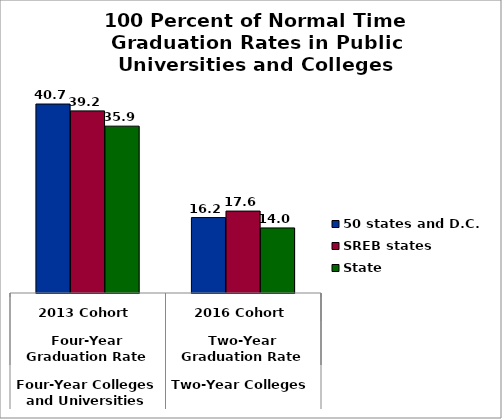
| Category | 50 states and D.C. | SREB states | State |
|---|---|---|---|
| 0 | 40.69 | 39.211 | 35.924 |
| 1 | 16.237 | 17.641 | 14.01 |